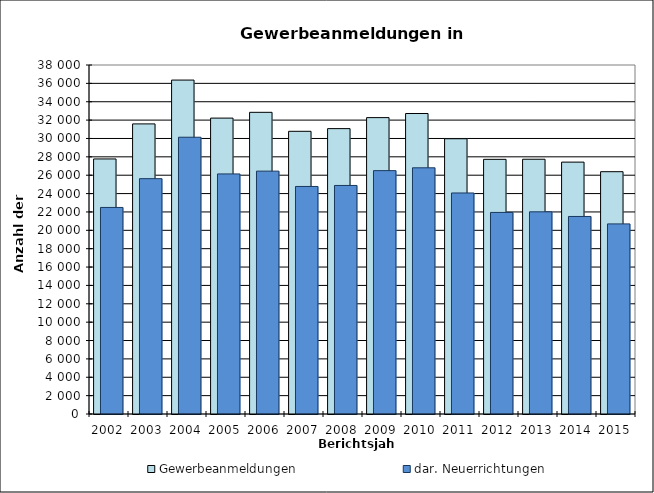
| Category | Gewerbeanmeldungen | dar. Neuerrichtungen |
|---|---|---|
| 2002.0 | 27771 | 22491 |
| 2003.0 | 31587 | 25624 |
| 2004.0 | 36359 | 30135 |
| 2005.0 | 32219 | 26140 |
| 2006.0 | 32847 | 26444 |
| 2007.0 | 30781 | 24775 |
| 2008.0 | 31074 | 24884 |
| 2009.0 | 32271 | 26499 |
| 2010.0 | 32718 | 26806 |
| 2011.0 | 29971 | 24066 |
| 2012.0 | 27728 | 21948 |
| 2013.0 | 27739 | 22013 |
| 2014.0 | 27426 | 21509 |
| 2015.0 | 26383 | 20698 |